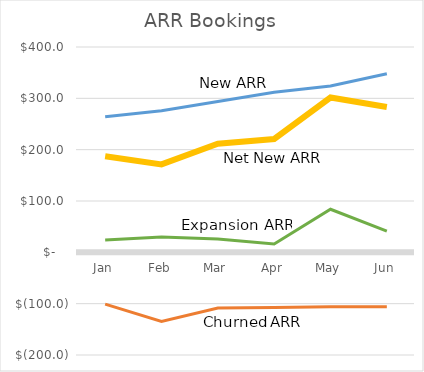
| Category | New ARR | Churned ARR | Expansion ARR | Net New ARR |
|---|---|---|---|---|
| Jan | 264 | -100.8 | 24 | 187.2 |
| Feb | 276 | -134.654 | 29.923 | 171.269 |
| Mar | 294 | -108.328 | 25.792 | 211.464 |
| Apr | 312 | -107.399 | 16.11 | 220.711 |
| May | 324 | -106.222 | 83.86 | 301.637 |
| Jun | 348 | -106.061 | 41.246 | 283.185 |